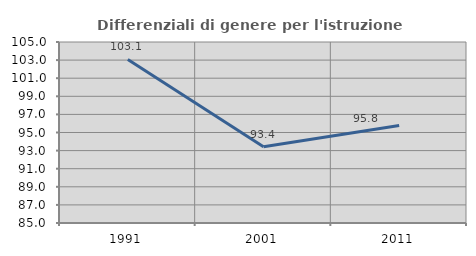
| Category | Differenziali di genere per l'istruzione superiore |
|---|---|
| 1991.0 | 103.071 |
| 2001.0 | 93.436 |
| 2011.0 | 95.764 |